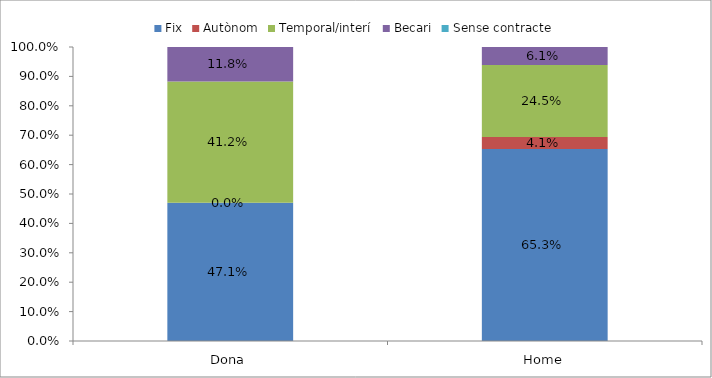
| Category | Fix | Autònom | Temporal/interí | Becari | Sense contracte |
|---|---|---|---|---|---|
| Dona | 0.471 | 0 | 0.412 | 0.118 | 0 |
| Home | 0.653 | 0.041 | 0.245 | 0.061 | 0 |